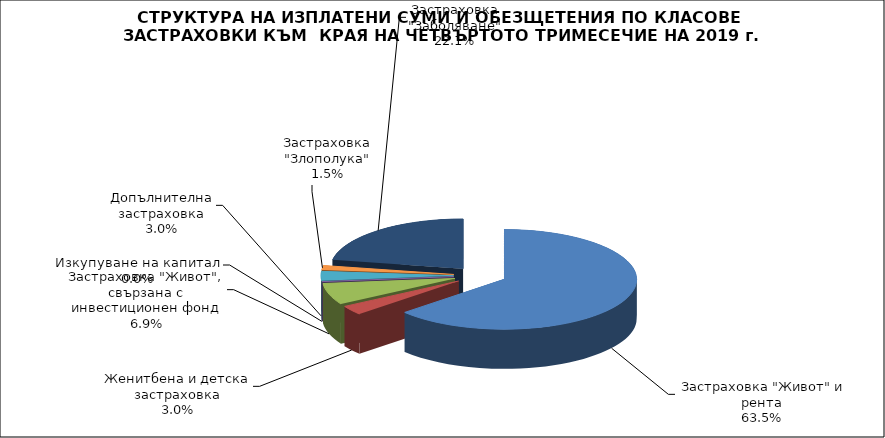
| Category | Series 0 |
|---|---|
|  Застраховка "Живот" и рента | 112840534.6 |
| Женитбена и детска застраховка | 5355493.756 |
| Застраховка "Живот", свързана с инвестиционен фонд | 12303033.375 |
| Изкупуване на капитал | 0 |
| Допълнителна застраховка | 5362644.425 |
| Застраховка "Злополука" | 2629865.838 |
| Застраховка "Заболяване" | 39341112.523 |